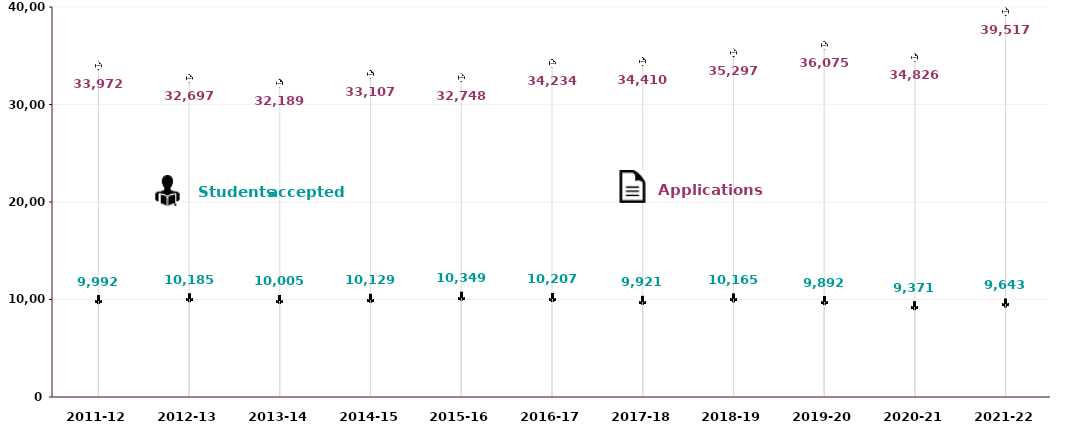
| Category | Applications | Students Accepted |
|---|---|---|
| 2011-12 | 33972 | 9992 |
| 2012-13 | 32697 | 10185 |
| 2013-14 | 32189 | 10005 |
| 2014-15 | 33107 | 10129 |
| 2015-16 | 32748 | 10349 |
| 2016-17 | 34234 | 10207 |
| 2017-18 | 34410 | 9921 |
| 2018-19 | 35297 | 10165 |
| 2019-20 | 36075 | 9892 |
| 2020-21 | 34826 | 9371 |
| 2021-22 | 39517 | 9643 |